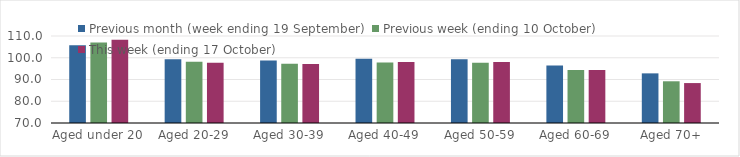
| Category | Previous month (week ending 19 September) | Previous week (ending 10 October) | This week (ending 17 October) |
|---|---|---|---|
| Aged under 20 | 105.78 | 107.01 | 108.22 |
| Aged 20-29 | 99.33 | 98.16 | 97.67 |
| Aged 30-39 | 98.7 | 97.29 | 97.14 |
| Aged 40-49 | 99.52 | 97.83 | 98.06 |
| Aged 50-59 | 99.26 | 97.7 | 97.99 |
| Aged 60-69 | 96.48 | 94.4 | 94.42 |
| Aged 70+ | 92.82 | 89.18 | 88.36 |